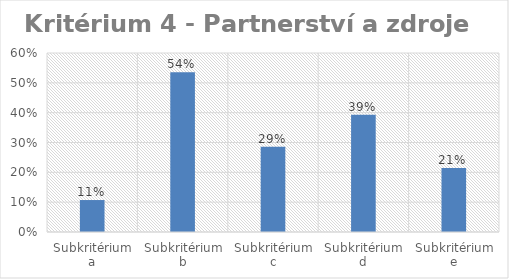
| Category | Series 0 |
|---|---|
| Subkritérium a | 0.107 |
| Subkritérium b | 0.536 |
| Subkritérium c | 0.286 |
| Subkritérium d | 0.393 |
| Subkritérium e | 0.214 |